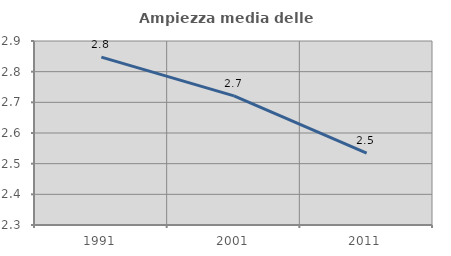
| Category | Ampiezza media delle famiglie |
|---|---|
| 1991.0 | 2.848 |
| 2001.0 | 2.721 |
| 2011.0 | 2.534 |